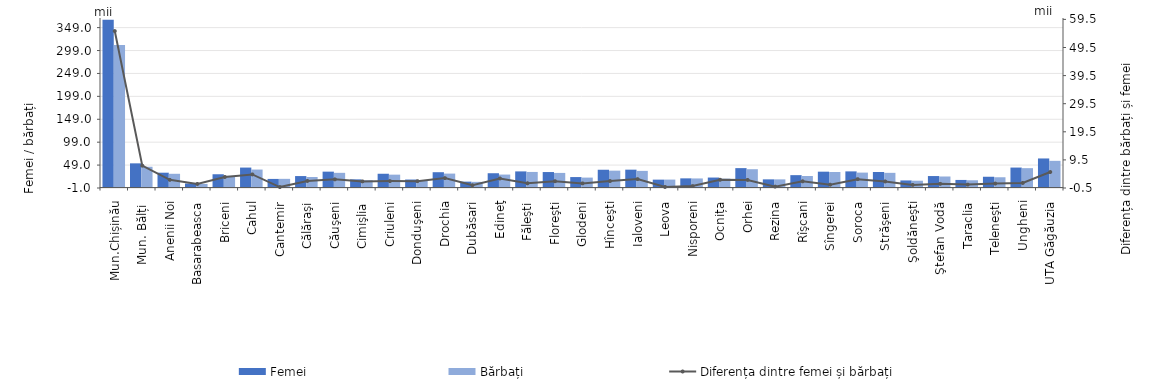
| Category | Femei | Bărbați  |
|---|---|---|
| Mun.Chișinău | 366.405 | 311.051 |
| Mun. Bălți  | 52.798 | 45.357 |
| Anenii Noi | 32.41 | 30.012 |
| Basarabeasca | 8.857 | 7.923 |
| Briceni | 29.009 | 25.59 |
| Cahul | 43.589 | 39.259 |
| Cantemir | 18.828 | 18.994 |
| Călăraşi | 25.051 | 23.04 |
| Căuşeni | 34.688 | 32.104 |
| Cimişlia | 17.848 | 15.999 |
| Criuleni | 30.096 | 28.137 |
| Donduşeni | 17.46 | 15.523 |
| Drochia | 33.472 | 30.454 |
| Dubăsari | 12.888 | 12.408 |
|  Edineţ | 31.225 | 28.328 |
| Făleşti | 35.231 | 34.052 |
| Floreşti | 33.834 | 31.917 |
| Glodeni | 22.866 | 21.721 |
| Hînceşti | 38.833 | 36.86 |
| Ialoveni | 39.015 | 36.347 |
| Leova | 17.241 | 17.372 |
| Nisporeni | 20.041 | 19.862 |
| Ocnița | 21.82 | 19.393 |
| Orhei | 42.376 | 40.001 |
| Rezina | 17.854 | 17.859 |
| Rîşcani | 27.051 | 25.166 |
| Sîngerei | 34.617 | 33.936 |
| Soroca | 35.266 | 32.615 |
| Străşeni | 33.913 | 32.084 |
| Şoldăneşti | 15.524 | 14.923 |
| Ştefan Vodă | 25.091 | 24.113 |
| Taraclia | 16.588 | 15.883 |
| Teleneşti | 23.541 | 22.456 |
| Ungheni | 43.599 | 42.318 |
| UTA Găgăuzia | 63.467 | 58.28 |